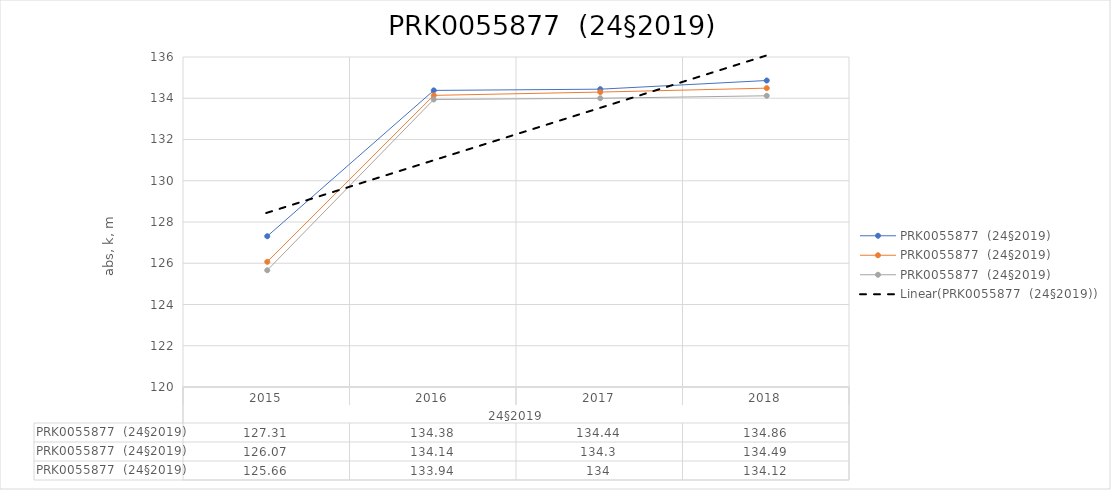
| Category | Maksimaalne veetase | Keskmine veetase | Minimaalne veetase |
|---|---|---|---|
| 0 | 127.31 | 126.07 | 125.66 |
| 1 | 134.38 | 134.14 | 133.94 |
| 2 | 134.44 | 134.3 | 134 |
| 3 | 134.86 | 134.49 | 134.12 |